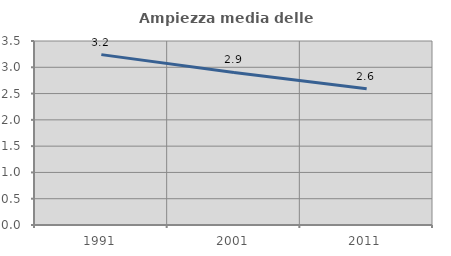
| Category | Ampiezza media delle famiglie |
|---|---|
| 1991.0 | 3.241 |
| 2001.0 | 2.903 |
| 2011.0 | 2.592 |